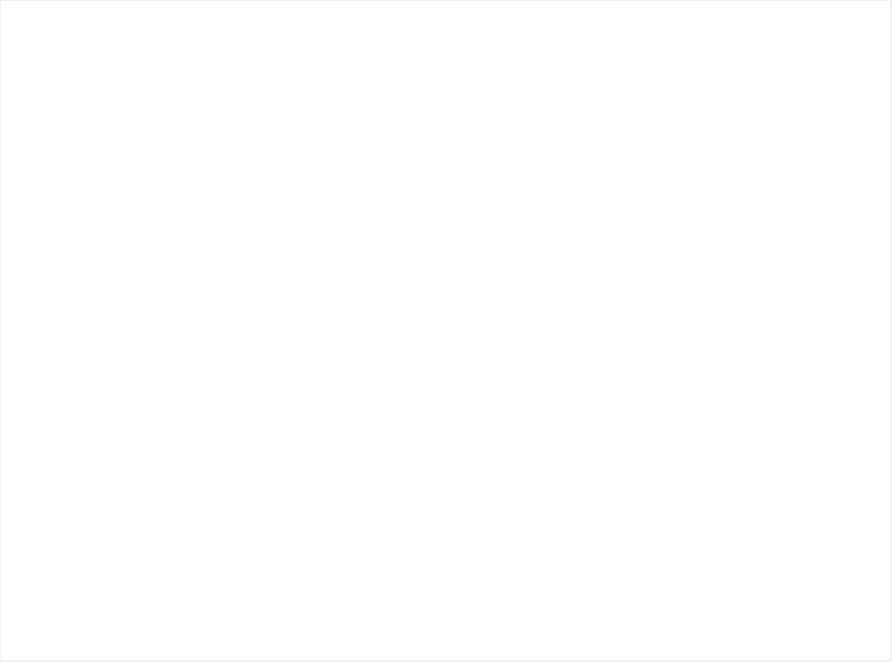
| Category | # of People adopt basic personal and community hygiene practices | # of people access to functioning  sanitation facilities | # of people Equitable and continuous access to sufficient quantity of domestic water |
|---|---|---|---|
| 0 | 4717 | 4129 | 1284.837 |
| 1 | 1895 | 2111 | 2111 |
| 2 | 4892 | 4130 | 4892 |
| 3 | 6936 | 5830 | 6936 |
| 4 | 11625 | 8160 | 11625 |
| 5 | 3360 | 0 | 3360 |
| 6 | 979 | 979 | 979 |
| 7 | 6042 | 3930 | 6042 |
| 8 | 3486 | 3486 | 3486 |
| 9 | 4645 | 2074 | 4645 |
| 10 | 4104 | 3023 | 2717.656 |
| 11 | 0 | 581 | 581 |
| 12 | 3095 | 3095 | 3095 |
| 13 | 13302 | 8870 | 13302 |
| 14 | 11487 | 6816 | 11487 |
| 15 | 11564 | 11564 | 11564 |
| 16 | 2805 | 2805 | 2805 |
| 17 | 2920 | 2920 | 2920 |
| 18 | 6016 | 4020 | 6016 |
| 19 | 5950 | 5030 | 5950 |
| 20 | 1670 | 800 | 1670 |
| 21 | 2186 | 1710 | 2186 |
| 22 | 2248 | 2200 | 2248 |
| 23 | 2285 | 2285 | 2285 |
| 24 | 114 | 100 | 114 |